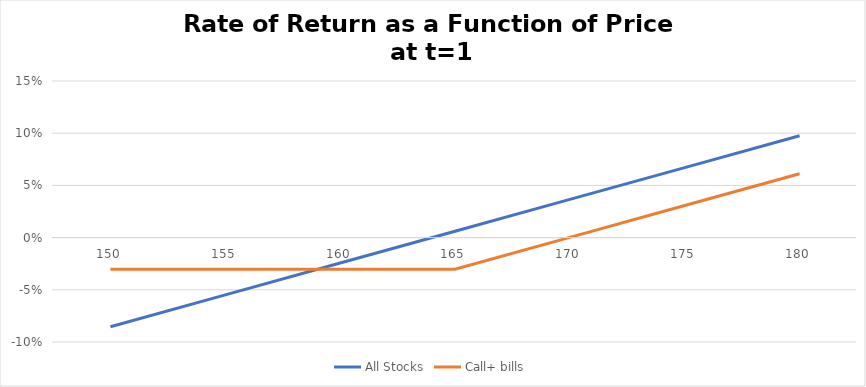
| Category | All Stocks | Call+ bills |
|---|---|---|
| 150.0 | -0.085 | -0.03 |
| 155.0 | -0.055 | -0.03 |
| 160.0 | -0.024 | -0.03 |
| 165.0 | 0.006 | -0.03 |
| 170.0 | 0.037 | 0 |
| 175.0 | 0.067 | 0.031 |
| 180.0 | 0.098 | 0.061 |